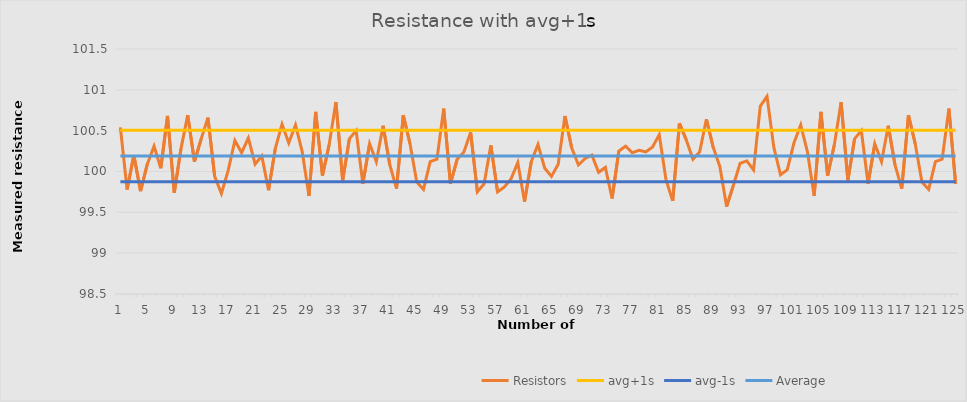
| Category | Resistors | avg+1s | avg-1s | Average |
|---|---|---|---|---|
| 0 | 100.54 | 100.506 | 99.874 | 100.19 |
| 1 | 99.78 | 100.506 | 99.874 | 100.19 |
| 2 | 100.2 | 100.506 | 99.874 | 100.19 |
| 3 | 99.76 | 100.506 | 99.874 | 100.19 |
| 4 | 100.09 | 100.506 | 99.874 | 100.19 |
| 5 | 100.31 | 100.506 | 99.874 | 100.19 |
| 6 | 100.04 | 100.506 | 99.874 | 100.19 |
| 7 | 100.68 | 100.506 | 99.874 | 100.19 |
| 8 | 99.74 | 100.506 | 99.874 | 100.19 |
| 9 | 100.28 | 100.506 | 99.874 | 100.19 |
| 10 | 100.69 | 100.506 | 99.874 | 100.19 |
| 11 | 100.12 | 100.506 | 99.874 | 100.19 |
| 12 | 100.4 | 100.506 | 99.874 | 100.19 |
| 13 | 100.66 | 100.506 | 99.874 | 100.19 |
| 14 | 99.94 | 100.506 | 99.874 | 100.19 |
| 15 | 99.73 | 100.506 | 99.874 | 100.19 |
| 16 | 100.01 | 100.506 | 99.874 | 100.19 |
| 17 | 100.38 | 100.506 | 99.874 | 100.19 |
| 18 | 100.23 | 100.506 | 99.874 | 100.19 |
| 19 | 100.41 | 100.506 | 99.874 | 100.19 |
| 20 | 100.09 | 100.506 | 99.874 | 100.19 |
| 21 | 100.19 | 100.506 | 99.874 | 100.19 |
| 22 | 99.77 | 100.506 | 99.874 | 100.19 |
| 23 | 100.28 | 100.506 | 99.874 | 100.19 |
| 24 | 100.58 | 100.506 | 99.874 | 100.19 |
| 25 | 100.35 | 100.506 | 99.874 | 100.19 |
| 26 | 100.57 | 100.506 | 99.874 | 100.19 |
| 27 | 100.24 | 100.506 | 99.874 | 100.19 |
| 28 | 99.7 | 100.506 | 99.874 | 100.19 |
| 29 | 100.73 | 100.506 | 99.874 | 100.19 |
| 30 | 99.95 | 100.506 | 99.874 | 100.19 |
| 31 | 100.33 | 100.506 | 99.874 | 100.19 |
| 32 | 100.85 | 100.506 | 99.874 | 100.19 |
| 33 | 99.89 | 100.506 | 99.874 | 100.19 |
| 34 | 100.4 | 100.506 | 99.874 | 100.19 |
| 35 | 100.5 | 100.506 | 99.874 | 100.19 |
| 36 | 99.85 | 100.506 | 99.874 | 100.19 |
| 37 | 100.34 | 100.506 | 99.874 | 100.19 |
| 38 | 100.12 | 100.506 | 99.874 | 100.19 |
| 39 | 100.56 | 100.506 | 99.874 | 100.19 |
| 40 | 100.08 | 100.506 | 99.874 | 100.19 |
| 41 | 99.79 | 100.506 | 99.874 | 100.19 |
| 42 | 100.69 | 100.506 | 99.874 | 100.19 |
| 43 | 100.34 | 100.506 | 99.874 | 100.19 |
| 44 | 99.87 | 100.506 | 99.874 | 100.19 |
| 45 | 99.78 | 100.506 | 99.874 | 100.19 |
| 46 | 100.12 | 100.506 | 99.874 | 100.19 |
| 47 | 100.15 | 100.506 | 99.874 | 100.19 |
| 48 | 100.77 | 100.506 | 99.874 | 100.19 |
| 49 | 99.85 | 100.506 | 99.874 | 100.19 |
| 50 | 100.15 | 100.506 | 99.874 | 100.19 |
| 51 | 100.24 | 100.506 | 99.874 | 100.19 |
| 52 | 100.48 | 100.506 | 99.874 | 100.19 |
| 53 | 99.75 | 100.506 | 99.874 | 100.19 |
| 54 | 99.85 | 100.506 | 99.874 | 100.19 |
| 55 | 100.32 | 100.506 | 99.874 | 100.19 |
| 56 | 99.75 | 100.506 | 99.874 | 100.19 |
| 57 | 99.81 | 100.506 | 99.874 | 100.19 |
| 58 | 99.91 | 100.506 | 99.874 | 100.19 |
| 59 | 100.11 | 100.506 | 99.874 | 100.19 |
| 60 | 99.63 | 100.506 | 99.874 | 100.19 |
| 61 | 100.12 | 100.506 | 99.874 | 100.19 |
| 62 | 100.33 | 100.506 | 99.874 | 100.19 |
| 63 | 100.04 | 100.506 | 99.874 | 100.19 |
| 64 | 99.94 | 100.506 | 99.874 | 100.19 |
| 65 | 100.09 | 100.506 | 99.874 | 100.19 |
| 66 | 100.68 | 100.506 | 99.874 | 100.19 |
| 67 | 100.29 | 100.506 | 99.874 | 100.19 |
| 68 | 100.08 | 100.506 | 99.874 | 100.19 |
| 69 | 100.16 | 100.506 | 99.874 | 100.19 |
| 70 | 100.2 | 100.506 | 99.874 | 100.19 |
| 71 | 99.99 | 100.506 | 99.874 | 100.19 |
| 72 | 100.05 | 100.506 | 99.874 | 100.19 |
| 73 | 99.67 | 100.506 | 99.874 | 100.19 |
| 74 | 100.25 | 100.506 | 99.874 | 100.19 |
| 75 | 100.31 | 100.506 | 99.874 | 100.19 |
| 76 | 100.23 | 100.506 | 99.874 | 100.19 |
| 77 | 100.26 | 100.506 | 99.874 | 100.19 |
| 78 | 100.24 | 100.506 | 99.874 | 100.19 |
| 79 | 100.3 | 100.506 | 99.874 | 100.19 |
| 80 | 100.45 | 100.506 | 99.874 | 100.19 |
| 81 | 99.9 | 100.506 | 99.874 | 100.19 |
| 82 | 99.64 | 100.506 | 99.874 | 100.19 |
| 83 | 100.59 | 100.506 | 99.874 | 100.19 |
| 84 | 100.39 | 100.506 | 99.874 | 100.19 |
| 85 | 100.15 | 100.506 | 99.874 | 100.19 |
| 86 | 100.24 | 100.506 | 99.874 | 100.19 |
| 87 | 100.64 | 100.506 | 99.874 | 100.19 |
| 88 | 100.3 | 100.506 | 99.874 | 100.19 |
| 89 | 100.06 | 100.506 | 99.874 | 100.19 |
| 90 | 99.57 | 100.506 | 99.874 | 100.19 |
| 91 | 99.83 | 100.506 | 99.874 | 100.19 |
| 92 | 100.1 | 100.506 | 99.874 | 100.19 |
| 93 | 100.13 | 100.506 | 99.874 | 100.19 |
| 94 | 100.02 | 100.506 | 99.874 | 100.19 |
| 95 | 100.8 | 100.506 | 99.874 | 100.19 |
| 96 | 100.92 | 100.506 | 99.874 | 100.19 |
| 97 | 100.3 | 100.506 | 99.874 | 100.19 |
| 98 | 99.96 | 100.506 | 99.874 | 100.19 |
| 99 | 100.02 | 100.506 | 99.874 | 100.19 |
| 100 | 100.35 | 100.506 | 99.874 | 100.19 |
| 101 | 100.57 | 100.506 | 99.874 | 100.19 |
| 102 | 100.24 | 100.506 | 99.874 | 100.19 |
| 103 | 99.7 | 100.506 | 99.874 | 100.19 |
| 104 | 100.73 | 100.506 | 99.874 | 100.19 |
| 105 | 99.95 | 100.506 | 99.874 | 100.19 |
| 106 | 100.33 | 100.506 | 99.874 | 100.19 |
| 107 | 100.85 | 100.506 | 99.874 | 100.19 |
| 108 | 99.89 | 100.506 | 99.874 | 100.19 |
| 109 | 100.4 | 100.506 | 99.874 | 100.19 |
| 110 | 100.5 | 100.506 | 99.874 | 100.19 |
| 111 | 99.85 | 100.506 | 99.874 | 100.19 |
| 112 | 100.34 | 100.506 | 99.874 | 100.19 |
| 113 | 100.12 | 100.506 | 99.874 | 100.19 |
| 114 | 100.56 | 100.506 | 99.874 | 100.19 |
| 115 | 100.08 | 100.506 | 99.874 | 100.19 |
| 116 | 99.79 | 100.506 | 99.874 | 100.19 |
| 117 | 100.69 | 100.506 | 99.874 | 100.19 |
| 118 | 100.34 | 100.506 | 99.874 | 100.19 |
| 119 | 99.87 | 100.506 | 99.874 | 100.19 |
| 120 | 99.78 | 100.506 | 99.874 | 100.19 |
| 121 | 100.12 | 100.506 | 99.874 | 100.19 |
| 122 | 100.15 | 100.506 | 99.874 | 100.19 |
| 123 | 100.77 | 100.506 | 99.874 | 100.19 |
| 124 | 99.85 | 100.506 | 99.874 | 100.19 |